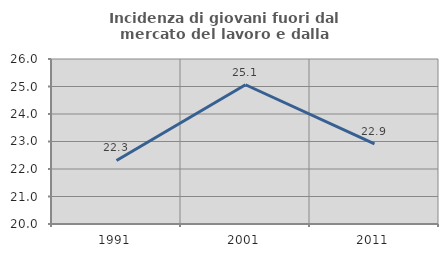
| Category | Incidenza di giovani fuori dal mercato del lavoro e dalla formazione  |
|---|---|
| 1991.0 | 22.31 |
| 2001.0 | 25.064 |
| 2011.0 | 22.918 |